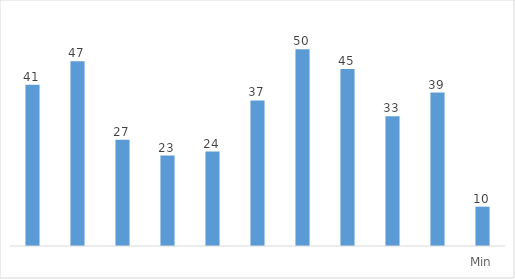
| Category | Sales |
|---|---|
|  | 41 |
|  | 47 |
|  | 27 |
|  | 23 |
|  | 24 |
|  | 37 |
|  | 50 |
|  | 45 |
|  | 33 |
|  | 39 |
| Min | 10 |